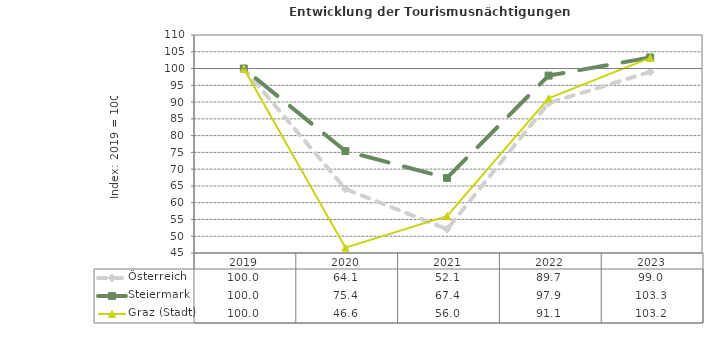
| Category | Österreich | Steiermark | Graz (Stadt) |
|---|---|---|---|
| 2023.0 | 99 | 103.3 | 103.2 |
| 2022.0 | 89.7 | 97.9 | 91.1 |
| 2021.0 | 52.1 | 67.4 | 56 |
| 2020.0 | 64.1 | 75.4 | 46.6 |
| 2019.0 | 100 | 100 | 100 |